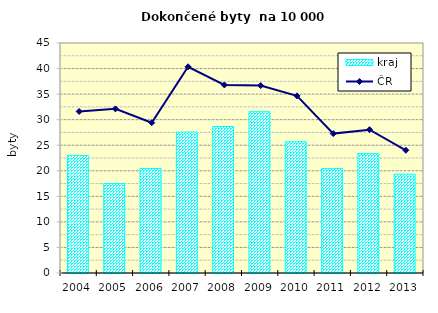
| Category | kraj |
|---|---|
| 2004.0 | 23.007 |
| 2005.0 | 17.497 |
| 2006.0 | 20.44 |
| 2007.0 | 27.572 |
| 2008.0 | 28.653 |
| 2009.0 | 31.56 |
| 2010.0 | 25.683 |
| 2011.0 | 20.427 |
| 2012.0 | 23.36 |
| 2013.0 | 19.335 |